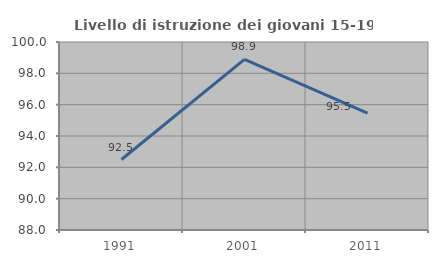
| Category | Livello di istruzione dei giovani 15-19 anni |
|---|---|
| 1991.0 | 92.5 |
| 2001.0 | 98.889 |
| 2011.0 | 95.455 |